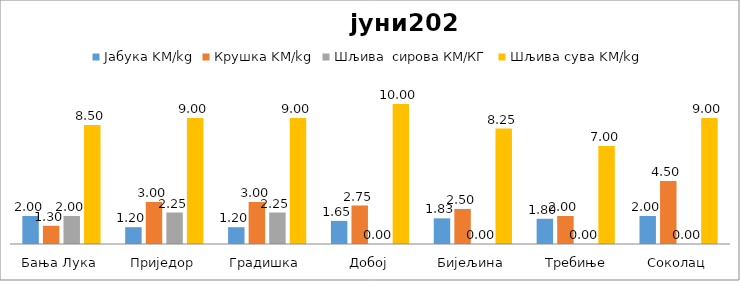
| Category | Јабука KM/kg | Крушка KM/kg | Шљива  сирова КМ/КГ | Шљива сува KM/kg |
|---|---|---|---|---|
| Бања Лука | 2 | 1.3 | 2 | 8.5 |
| Приједор | 1.2 | 3 | 2.25 | 9 |
| Градишка | 1.2 | 3 | 2.25 | 9 |
| Добој | 1.65 | 2.75 | 0 | 10 |
| Бијељина | 1.833 | 2.5 | 0 | 8.25 |
|  Требиње | 1.8 | 2 | 0 | 7 |
| Соколац | 2 | 4.5 | 0 | 9 |